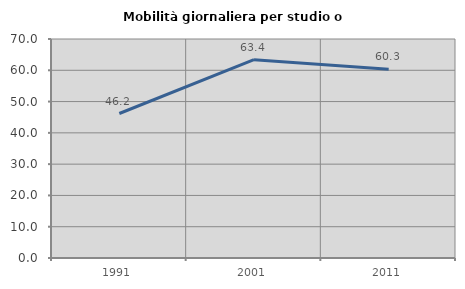
| Category | Mobilità giornaliera per studio o lavoro |
|---|---|
| 1991.0 | 46.182 |
| 2001.0 | 63.38 |
| 2011.0 | 60.327 |